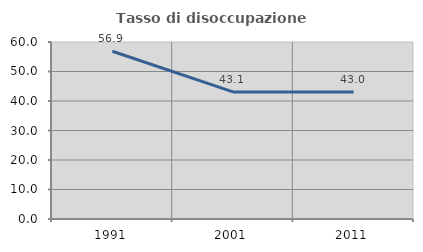
| Category | Tasso di disoccupazione giovanile  |
|---|---|
| 1991.0 | 56.87 |
| 2001.0 | 43.089 |
| 2011.0 | 43.046 |